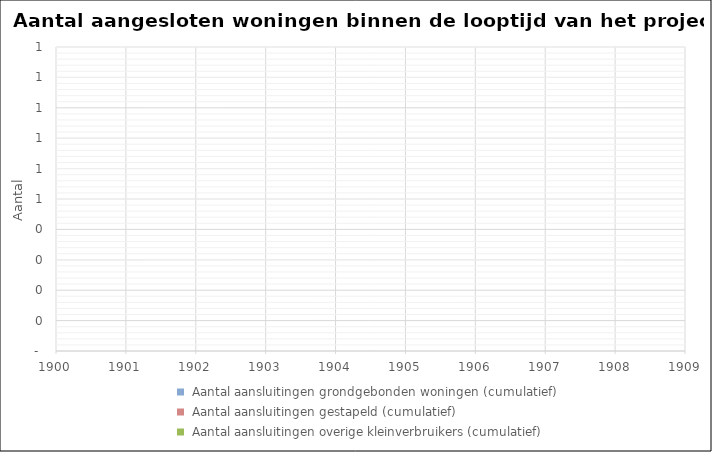
| Category |  Aantal aansluitingen grondgebonden woningen (cumulatief) |  Aantal aansluitingen gestapeld (cumulatief) |  Aantal aansluitingen overige kleinverbruikers (cumulatief) |
|---|---|---|---|
| 1900.0 | 0 | 0 | 0 |
| 1901.0 | 0 | 0 | 0 |
| 1902.0 | 0 | 0 | 0 |
| 1903.0 | 0 | 0 | 0 |
| 1904.0 | 0 | 0 | 0 |
| 1905.0 | 0 | 0 | 0 |
| 1906.0 | 0 | 0 | 0 |
| 1907.0 | 0 | 0 | 0 |
| 1908.0 | 0 | 0 | 0 |
| 1909.0 | 0 | 0 | 0 |